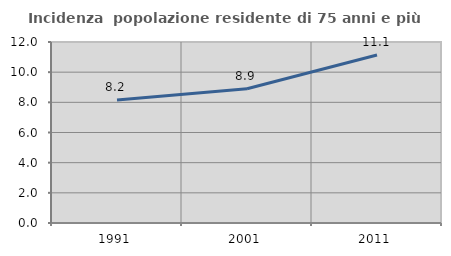
| Category | Incidenza  popolazione residente di 75 anni e più |
|---|---|
| 1991.0 | 8.16 |
| 2001.0 | 8.898 |
| 2011.0 | 11.139 |